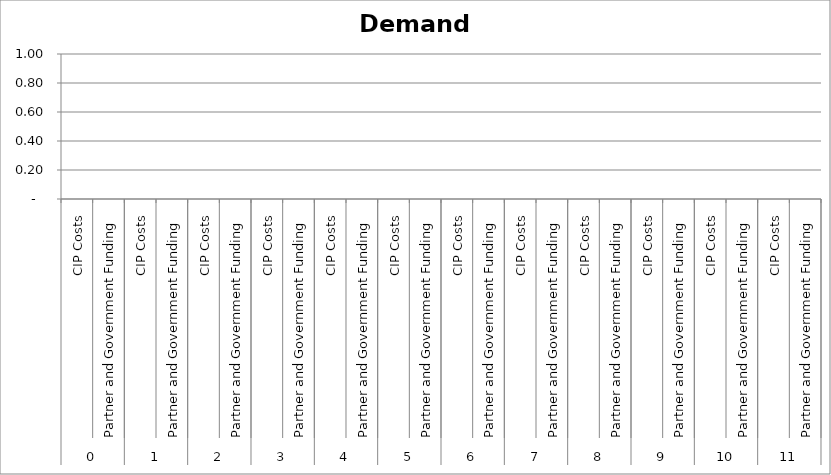
| Category | Demand Generation |
|---|---|
| 0 | 0 |
| 1 | 0 |
| 2 | 0 |
| 3 | 0 |
| 4 | 0 |
| 5 | 0 |
| 6 | 0 |
| 7 | 0 |
| 8 | 0 |
| 9 | 0 |
| 10 | 0 |
| 11 | 0 |
| 12 | 0 |
| 13 | 0 |
| 14 | 0 |
| 15 | 0 |
| 16 | 0 |
| 17 | 0 |
| 18 | 0 |
| 19 | 0 |
| 20 | 0 |
| 21 | 0 |
| 22 | 0 |
| 23 | 0 |